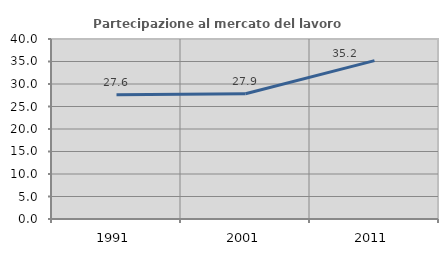
| Category | Partecipazione al mercato del lavoro  femminile |
|---|---|
| 1991.0 | 27.603 |
| 2001.0 | 27.851 |
| 2011.0 | 35.198 |